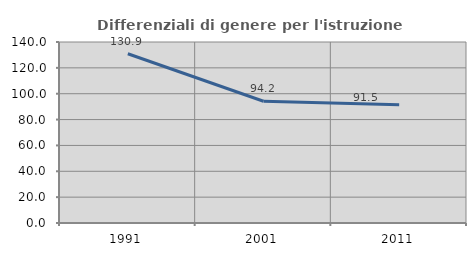
| Category | Differenziali di genere per l'istruzione superiore |
|---|---|
| 1991.0 | 130.909 |
| 2001.0 | 94.151 |
| 2011.0 | 91.508 |